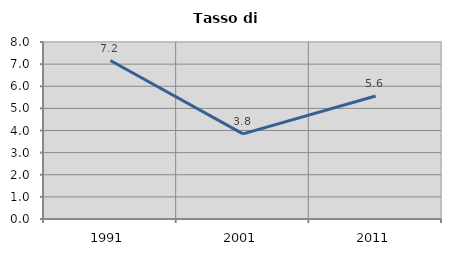
| Category | Tasso di disoccupazione   |
|---|---|
| 1991.0 | 7.163 |
| 2001.0 | 3.847 |
| 2011.0 | 5.56 |